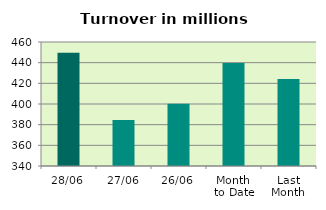
| Category | Series 0 |
|---|---|
| 28/06 | 449.579 |
| 27/06 | 384.417 |
| 26/06 | 400.357 |
| Month 
to Date | 439.695 |
| Last
Month | 424.091 |